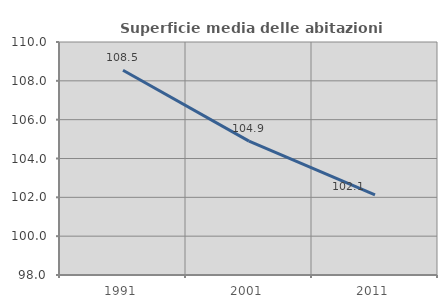
| Category | Superficie media delle abitazioni occupate |
|---|---|
| 1991.0 | 108.543 |
| 2001.0 | 104.897 |
| 2011.0 | 102.122 |